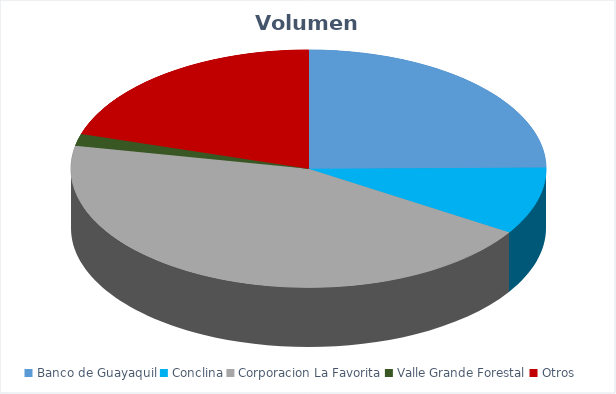
| Category | VOLUMEN ($USD) |
|---|---|
| Banco de Guayaquil | 23930.3 |
| Conclina | 8829 |
| Corporacion La Favorita | 42447.16 |
| Valle Grande Forestal | 1560 |
| Otros | 19546.82 |